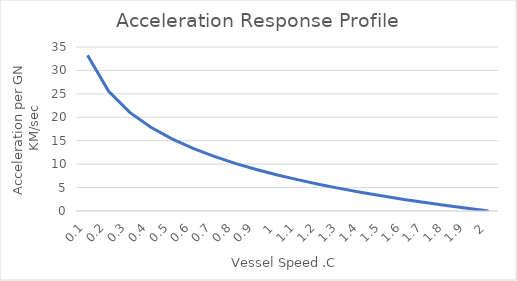
| Category | Acceleration |
|---|---|
| 0.1 | 33.246 |
| 0.2 | 25.553 |
| 0.30000000000000004 | 21.054 |
| 0.4 | 17.861 |
| 0.5 | 15.385 |
| 0.6 | 13.361 |
| 0.7 | 11.651 |
| 0.7999999999999999 | 10.169 |
| 0.8999999999999999 | 8.862 |
| 0.9999999999999999 | 7.692 |
| 1.0999999999999999 | 6.635 |
| 1.2 | 5.669 |
| 1.3 | 4.781 |
| 1.4000000000000001 | 3.958 |
| 1.5000000000000002 | 3.193 |
| 1.6000000000000003 | 2.476 |
| 1.7000000000000004 | 1.804 |
| 1.8000000000000005 | 1.169 |
| 1.9000000000000006 | 0.569 |
| 2.0000000000000004 | 0 |